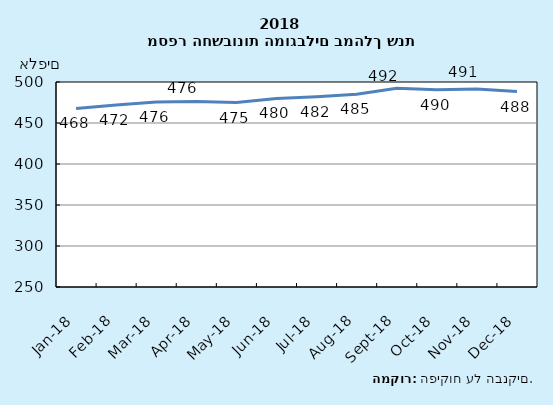
| Category | סה"כ חשבונות |
|---|---|
| 2018-12-31 | 488.282 |
| 2018-11-30 | 491.456 |
| 2018-10-31 | 490.427 |
| 2018-09-30 | 492.37 |
| 2018-08-31 | 484.93 |
| 2018-07-31 | 482.127 |
| 2018-06-30 | 479.929 |
| 2018-05-31 | 474.923 |
| 2018-04-30 | 476.253 |
| 2018-03-31 | 475.73 |
| 2018-02-28 | 471.931 |
| 2018-01-31 | 467.773 |